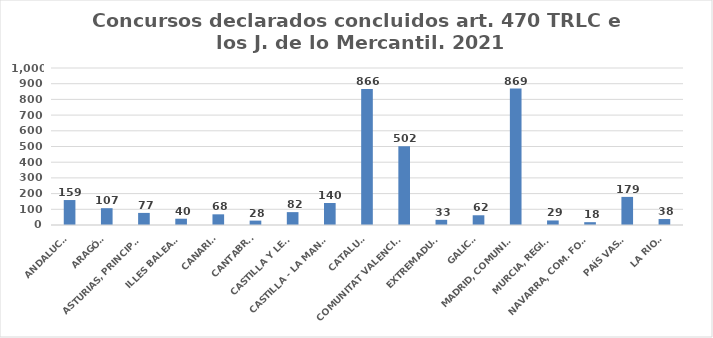
| Category | Series 0 |
|---|---|
| ANDALUCÍA | 159 |
| ARAGÓN | 107 |
| ASTURIAS, PRINCIPADO | 77 |
| ILLES BALEARS | 40 |
| CANARIAS | 68 |
| CANTABRIA | 28 |
| CASTILLA Y LEÓN | 82 |
| CASTILLA - LA MANCHA | 140 |
| CATALUÑA | 866 |
| COMUNITAT VALENCIANA | 502 |
| EXTREMADURA | 33 |
| GALICIA | 62 |
| MADRID, COMUNIDAD | 869 |
| MURCIA, REGIÓN | 29 |
| NAVARRA, COM. FORAL | 18 |
| PAÍS VASCO | 179 |
| LA RIOJA | 38 |